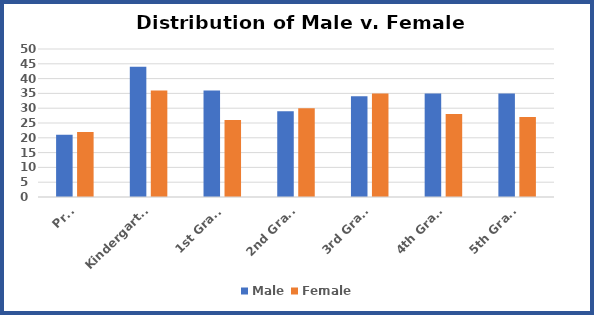
| Category | Male | Female |
|---|---|---|
| PreK | 21 | 22 |
| Kindergarten | 44 | 36 |
| 1st Grade | 36 | 26 |
| 2nd Grade | 29 | 30 |
| 3rd Grade | 34 | 35 |
| 4th Grade | 35 | 28 |
| 5th Grade | 35 | 27 |